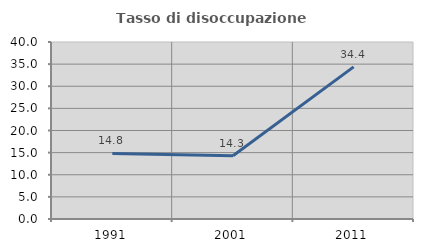
| Category | Tasso di disoccupazione giovanile  |
|---|---|
| 1991.0 | 14.815 |
| 2001.0 | 14.286 |
| 2011.0 | 34.375 |